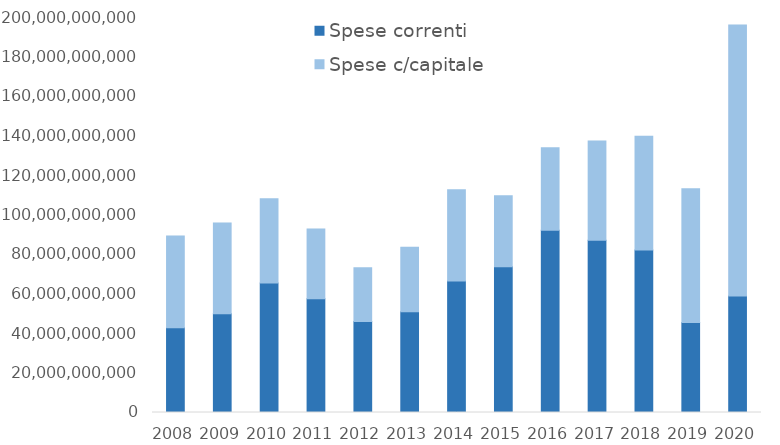
| Category | Spese correnti | Spese c/capitale |
|---|---|---|
| 2008.0 | 42893953000 | 46442360000 |
| 2009.0 | 50059217000 | 45866639000 |
| 2010.0 | 65621000000 | 42582000000 |
| 2011.0 | 57583816390.88 | 35380027229.73 |
| 2012.0 | 46058542143.35 | 27288631413.08 |
| 2013.0 | 51042043323.31 | 32608325232.85 |
| 2014.0 | 66601643726.18 | 46189902501.64 |
| 2015.0 | 73736463947.24 | 35954785504.87 |
| 2016.0 | 92316792259.88 | 41756911077.56 |
| 2017.0 | 87211420097.46 | 50218793198.99 |
| 2018.0 | 82319023262.39 | 57536065822.9 |
| 2019.0 | 45529016908.88 | 67732785328.95 |
| 2020.0 | 58960256673.41 | 137241913804.88 |